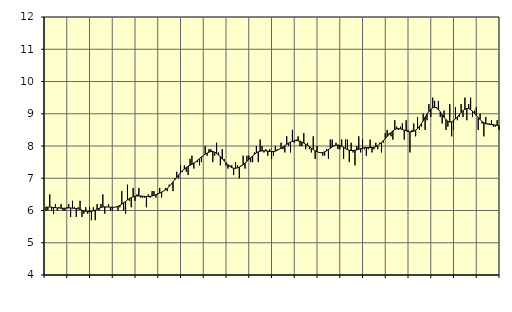
| Category | Piggar | Byggverksamhet, SNI 41-43 |
|---|---|---|
| nan | 6 | 6.11 |
| 1.0 | 6 | 6.1 |
| 1.0 | 6.5 | 6.11 |
| 1.0 | 6 | 6.1 |
| 1.0 | 5.9 | 6.09 |
| 1.0 | 6.2 | 6.09 |
| 1.0 | 6 | 6.08 |
| 1.0 | 6.1 | 6.08 |
| 1.0 | 6.2 | 6.07 |
| 1.0 | 6 | 6.07 |
| 1.0 | 6 | 6.07 |
| 1.0 | 6.1 | 6.08 |
| nan | 6.2 | 6.08 |
| 2.0 | 5.8 | 6.08 |
| 2.0 | 6.3 | 6.07 |
| 2.0 | 6.1 | 6.07 |
| 2.0 | 5.8 | 6.06 |
| 2.0 | 6.1 | 6.05 |
| 2.0 | 6.3 | 6.03 |
| 2.0 | 5.8 | 6.01 |
| 2.0 | 5.9 | 5.99 |
| 2.0 | 6.1 | 5.98 |
| 2.0 | 5.9 | 5.97 |
| 2.0 | 6.1 | 5.96 |
| nan | 5.7 | 5.97 |
| 3.0 | 6.1 | 5.99 |
| 3.0 | 5.7 | 6.01 |
| 3.0 | 6.2 | 6.04 |
| 3.0 | 6 | 6.07 |
| 3.0 | 6.2 | 6.09 |
| 3.0 | 6.5 | 6.11 |
| 3.0 | 5.9 | 6.11 |
| 3.0 | 6.1 | 6.11 |
| 3.0 | 6.2 | 6.11 |
| 3.0 | 6 | 6.1 |
| 3.0 | 6 | 6.1 |
| nan | 6.1 | 6.1 |
| 4.0 | 6.1 | 6.11 |
| 4.0 | 6 | 6.13 |
| 4.0 | 6.1 | 6.16 |
| 4.0 | 6.6 | 6.2 |
| 4.0 | 6 | 6.24 |
| 4.0 | 5.9 | 6.28 |
| 4.0 | 6.8 | 6.33 |
| 4.0 | 6.3 | 6.37 |
| 4.0 | 6.1 | 6.4 |
| 4.0 | 6.7 | 6.43 |
| 4.0 | 6.3 | 6.44 |
| nan | 6.5 | 6.45 |
| 5.0 | 6.7 | 6.45 |
| 5.0 | 6.4 | 6.45 |
| 5.0 | 6.4 | 6.44 |
| 5.0 | 6.4 | 6.44 |
| 5.0 | 6.1 | 6.43 |
| 5.0 | 6.5 | 6.43 |
| 5.0 | 6.4 | 6.44 |
| 5.0 | 6.6 | 6.45 |
| 5.0 | 6.6 | 6.47 |
| 5.0 | 6.4 | 6.49 |
| 5.0 | 6.5 | 6.52 |
| nan | 6.7 | 6.54 |
| 6.0 | 6.4 | 6.57 |
| 6.0 | 6.6 | 6.6 |
| 6.0 | 6.7 | 6.64 |
| 6.0 | 6.6 | 6.68 |
| 6.0 | 6.8 | 6.75 |
| 6.0 | 6.8 | 6.81 |
| 6.0 | 6.6 | 6.89 |
| 6.0 | 7 | 6.96 |
| 6.0 | 7.2 | 7.03 |
| 6.0 | 7 | 7.1 |
| 6.0 | 7.4 | 7.17 |
| nan | 7.2 | 7.23 |
| 7.0 | 7.4 | 7.29 |
| 7.0 | 7.2 | 7.33 |
| 7.0 | 7.1 | 7.37 |
| 7.0 | 7.6 | 7.4 |
| 7.0 | 7.7 | 7.43 |
| 7.0 | 7.3 | 7.47 |
| 7.0 | 7.5 | 7.51 |
| 7.0 | 7.5 | 7.56 |
| 7.0 | 7.4 | 7.61 |
| 7.0 | 7.5 | 7.66 |
| 7.0 | 7.7 | 7.7 |
| nan | 8 | 7.75 |
| 8.0 | 7.7 | 7.78 |
| 8.0 | 7.9 | 7.81 |
| 8.0 | 7.9 | 7.83 |
| 8.0 | 7.5 | 7.83 |
| 8.0 | 7.7 | 7.81 |
| 8.0 | 8.1 | 7.77 |
| 8.0 | 7.8 | 7.72 |
| 8.0 | 7.4 | 7.67 |
| 8.0 | 7.9 | 7.6 |
| 8.0 | 7.6 | 7.54 |
| 8.0 | 7.4 | 7.48 |
| nan | 7.3 | 7.42 |
| 9.0 | 7.4 | 7.37 |
| 9.0 | 7.4 | 7.33 |
| 9.0 | 7.1 | 7.31 |
| 9.0 | 7.5 | 7.31 |
| 9.0 | 7.4 | 7.32 |
| 9.0 | 7 | 7.35 |
| 9.0 | 7.4 | 7.38 |
| 9.0 | 7.7 | 7.42 |
| 9.0 | 7.3 | 7.47 |
| 9.0 | 7.7 | 7.52 |
| 9.0 | 7.7 | 7.58 |
| nan | 7.5 | 7.64 |
| 10.0 | 7.5 | 7.69 |
| 10.0 | 7.8 | 7.74 |
| 10.0 | 8 | 7.79 |
| 10.0 | 7.5 | 7.82 |
| 10.0 | 8.2 | 7.84 |
| 10.0 | 8 | 7.85 |
| 10.0 | 7.8 | 7.85 |
| 10.0 | 7.9 | 7.85 |
| 10.0 | 7.7 | 7.84 |
| 10.0 | 7.9 | 7.83 |
| 10.0 | 7.6 | 7.83 |
| nan | 7.7 | 7.83 |
| 11.0 | 8 | 7.84 |
| 11.0 | 7.9 | 7.87 |
| 11.0 | 7.9 | 7.9 |
| 11.0 | 8.1 | 7.93 |
| 11.0 | 7.9 | 7.97 |
| 11.0 | 7.8 | 8.01 |
| 11.0 | 8.3 | 8.05 |
| 11.0 | 8 | 8.09 |
| 11.0 | 7.8 | 8.12 |
| 11.0 | 8.5 | 8.14 |
| 11.0 | 8.1 | 8.16 |
| nan | 8.2 | 8.17 |
| 12.0 | 8.3 | 8.16 |
| 12.0 | 8 | 8.15 |
| 12.0 | 8 | 8.12 |
| 12.0 | 8.4 | 8.09 |
| 12.0 | 7.9 | 8.05 |
| 12.0 | 8.1 | 8.02 |
| 12.0 | 7.9 | 7.98 |
| 12.0 | 7.8 | 7.93 |
| 12.0 | 8.3 | 7.89 |
| 12.0 | 7.6 | 7.85 |
| 12.0 | 8 | 7.82 |
| nan | 7.8 | 7.8 |
| 13.0 | 7.8 | 7.79 |
| 13.0 | 7.7 | 7.8 |
| 13.0 | 7.7 | 7.82 |
| 13.0 | 7.9 | 7.85 |
| 13.0 | 7.6 | 7.89 |
| 13.0 | 8.2 | 7.93 |
| 13.0 | 8.2 | 7.97 |
| 13.0 | 8 | 8.01 |
| 13.0 | 8.1 | 8.03 |
| 13.0 | 7.9 | 8.03 |
| 13.0 | 7.9 | 8.02 |
| nan | 8.2 | 7.99 |
| 14.0 | 7.6 | 7.96 |
| 14.0 | 8.2 | 7.92 |
| 14.0 | 8.2 | 7.89 |
| 14.0 | 7.5 | 7.87 |
| 14.0 | 8.1 | 7.86 |
| 14.0 | 7.8 | 7.86 |
| 14.0 | 7.4 | 7.87 |
| 14.0 | 8 | 7.88 |
| 14.0 | 8.3 | 7.9 |
| 14.0 | 7.8 | 7.92 |
| 14.0 | 8.2 | 7.93 |
| nan | 7.9 | 7.95 |
| 15.0 | 7.7 | 7.95 |
| 15.0 | 7.9 | 7.95 |
| 15.0 | 8.2 | 7.95 |
| 15.0 | 7.8 | 7.95 |
| 15.0 | 7.9 | 7.96 |
| 15.0 | 8.1 | 7.98 |
| 15.0 | 7.9 | 8.01 |
| 15.0 | 8.1 | 8.06 |
| 15.0 | 7.8 | 8.11 |
| 15.0 | 8.1 | 8.17 |
| 15.0 | 8.4 | 8.23 |
| nan | 8.5 | 8.29 |
| 16.0 | 8.4 | 8.36 |
| 16.0 | 8.3 | 8.42 |
| 16.0 | 8.2 | 8.47 |
| 16.0 | 8.8 | 8.51 |
| 16.0 | 8.6 | 8.53 |
| 16.0 | 8.5 | 8.54 |
| 16.0 | 8.6 | 8.53 |
| 16.0 | 8.7 | 8.51 |
| 16.0 | 8.2 | 8.49 |
| 16.0 | 8.8 | 8.47 |
| 16.0 | 8.5 | 8.45 |
| nan | 7.8 | 8.44 |
| 17.0 | 8.5 | 8.44 |
| 17.0 | 8.7 | 8.46 |
| 17.0 | 8.3 | 8.49 |
| 17.0 | 8.9 | 8.54 |
| 17.0 | 8.5 | 8.61 |
| 17.0 | 8.6 | 8.69 |
| 17.0 | 9 | 8.78 |
| 17.0 | 8.5 | 8.89 |
| 17.0 | 8.8 | 8.99 |
| 17.0 | 9.3 | 9.07 |
| 17.0 | 8.9 | 9.14 |
| nan | 9.5 | 9.18 |
| 18.0 | 9.4 | 9.2 |
| 18.0 | 9.2 | 9.18 |
| 18.0 | 9.4 | 9.13 |
| 18.0 | 8.9 | 9.06 |
| 18.0 | 8.7 | 8.97 |
| 18.0 | 9.1 | 8.89 |
| 18.0 | 8.5 | 8.82 |
| 18.0 | 8.6 | 8.77 |
| 18.0 | 9.3 | 8.74 |
| 18.0 | 8.3 | 8.75 |
| 18.0 | 8.5 | 8.79 |
| nan | 9.2 | 8.84 |
| 19.0 | 8.8 | 8.9 |
| 19.0 | 8.9 | 8.97 |
| 19.0 | 9.3 | 9.04 |
| 19.0 | 8.9 | 9.1 |
| 19.0 | 9.5 | 9.14 |
| 19.0 | 8.8 | 9.16 |
| 19.0 | 9.3 | 9.16 |
| 19.0 | 9.5 | 9.13 |
| 19.0 | 8.9 | 9.08 |
| 19.0 | 9.1 | 9.02 |
| 19.0 | 9.2 | 8.95 |
| nan | 8.5 | 8.88 |
| 20.0 | 9 | 8.82 |
| 20.0 | 8.7 | 8.76 |
| 20.0 | 8.3 | 8.72 |
| 20.0 | 8.9 | 8.69 |
| 20.0 | 8.7 | 8.68 |
| 20.0 | 8.7 | 8.67 |
| 20.0 | 8.8 | 8.67 |
| 20.0 | 8.6 | 8.66 |
| 20.0 | 8.6 | 8.65 |
| 20.0 | 8.8 | 8.64 |
| 20.0 | 8.5 | 8.63 |